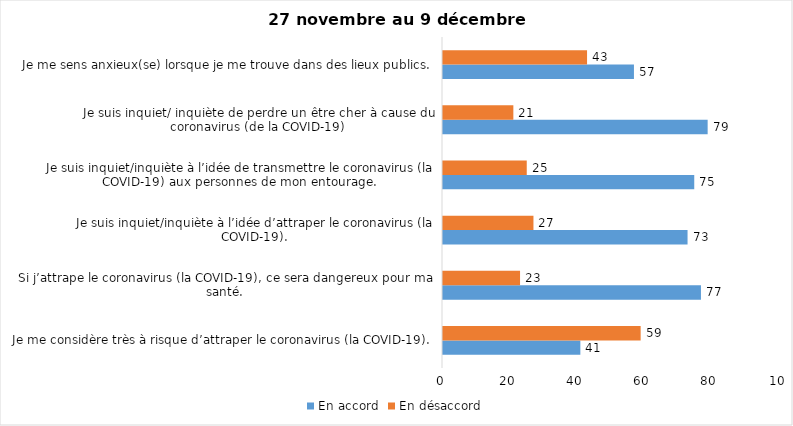
| Category | En accord | En désaccord |
|---|---|---|
| Je me considère très à risque d’attraper le coronavirus (la COVID-19). | 41 | 59 |
| Si j’attrape le coronavirus (la COVID-19), ce sera dangereux pour ma santé. | 77 | 23 |
| Je suis inquiet/inquiète à l’idée d’attraper le coronavirus (la COVID-19). | 73 | 27 |
| Je suis inquiet/inquiète à l’idée de transmettre le coronavirus (la COVID-19) aux personnes de mon entourage. | 75 | 25 |
| Je suis inquiet/ inquiète de perdre un être cher à cause du coronavirus (de la COVID-19) | 79 | 21 |
| Je me sens anxieux(se) lorsque je me trouve dans des lieux publics. | 57 | 43 |